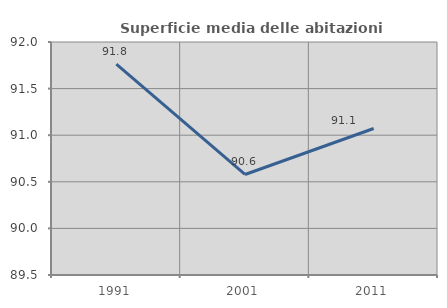
| Category | Superficie media delle abitazioni occupate |
|---|---|
| 1991.0 | 91.764 |
| 2001.0 | 90.579 |
| 2011.0 | 91.072 |